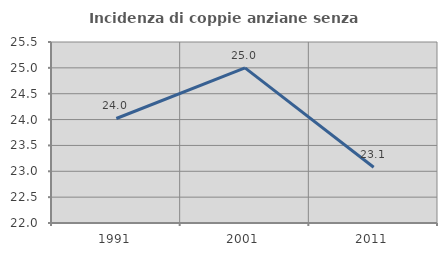
| Category | Incidenza di coppie anziane senza figli  |
|---|---|
| 1991.0 | 24.021 |
| 2001.0 | 25 |
| 2011.0 | 23.077 |